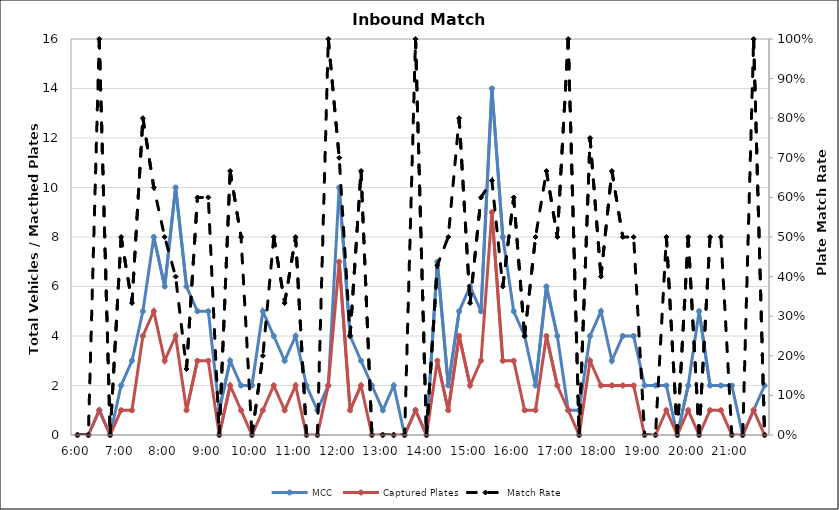
| Category | MCC | Captured Plates |
|---|---|---|
| 0.25 | 0 | 0 |
| 0.260416666666667 | 0 | 0 |
| 0.270833333333333 | 1 | 1 |
| 0.28125 | 0 | 0 |
| 0.291666666666667 | 2 | 1 |
| 0.302083333333333 | 3 | 1 |
| 0.3125 | 5 | 4 |
| 0.322916666666667 | 8 | 5 |
| 0.333333333333333 | 6 | 3 |
| 0.34375 | 10 | 4 |
| 0.354166666666667 | 6 | 1 |
| 0.364583333333333 | 5 | 3 |
| 0.375 | 5 | 3 |
| 0.385416666666667 | 1 | 0 |
| 0.395833333333333 | 3 | 2 |
| 0.40625 | 2 | 1 |
| 0.416666666666667 | 2 | 0 |
| 0.427083333333333 | 5 | 1 |
| 0.4375 | 4 | 2 |
| 0.447916666666667 | 3 | 1 |
| 0.458333333333333 | 4 | 2 |
| 0.46875 | 2 | 0 |
| 0.479166666666667 | 1 | 0 |
| 0.489583333333333 | 2 | 2 |
| 0.5 | 10 | 7 |
| 0.510416666666667 | 4 | 1 |
| 0.520833333333333 | 3 | 2 |
| 0.53125 | 2 | 0 |
| 0.541666666666667 | 1 | 0 |
| 0.552083333333333 | 2 | 0 |
| 0.5625 | 0 | 0 |
| 0.572916666666667 | 1 | 1 |
| 0.583333333333333 | 0 | 0 |
| 0.59375 | 7 | 3 |
| 0.604166666666667 | 2 | 1 |
| 0.614583333333333 | 5 | 4 |
| 0.625 | 6 | 2 |
| 0.635416666666667 | 5 | 3 |
| 0.645833333333333 | 14 | 9 |
| 0.65625 | 8 | 3 |
| 0.666666666666667 | 5 | 3 |
| 0.677083333333333 | 4 | 1 |
| 0.6875 | 2 | 1 |
| 0.697916666666667 | 6 | 4 |
| 0.708333333333333 | 4 | 2 |
| 0.71875 | 1 | 1 |
| 0.729166666666667 | 1 | 0 |
| 0.739583333333333 | 4 | 3 |
| 0.75 | 5 | 2 |
| 0.760416666666667 | 3 | 2 |
| 0.770833333333333 | 4 | 2 |
| 0.78125 | 4 | 2 |
| 0.791666666666667 | 2 | 0 |
| 0.802083333333333 | 2 | 0 |
| 0.8125 | 2 | 1 |
| 0.822916666666667 | 0 | 0 |
| 0.833333333333333 | 2 | 1 |
| 0.84375 | 5 | 0 |
| 0.854166666666667 | 2 | 1 |
| 0.864583333333333 | 2 | 1 |
| 0.875 | 2 | 0 |
| 0.885416666666667 | 0 | 0 |
| 0.895833333333333 | 1 | 1 |
| 0.90625 | 2 | 0 |